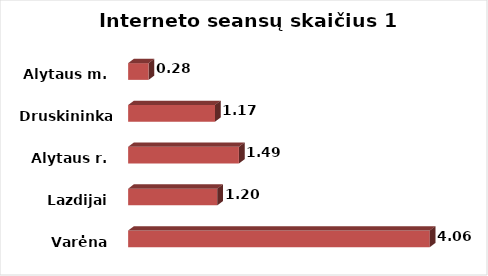
| Category | Series 0 |
|---|---|
| Varėna | 4.056 |
| Lazdijai | 1.199 |
| Alytaus r. | 1.489 |
| Druskininkai  | 1.168 |
| Alytaus m. | 0.276 |